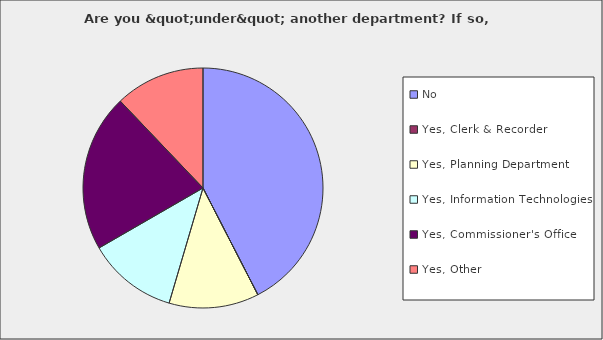
| Category | Series 0 |
|---|---|
| No | 0.424 |
| Yes, Clerk & Recorder | 0 |
| Yes, Planning Department | 0.121 |
| Yes, Information Technologies | 0.121 |
| Yes, Commissioner's Office | 0.212 |
| Yes, Other | 0.121 |